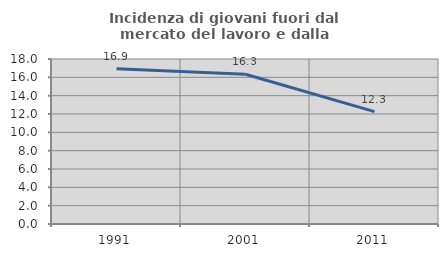
| Category | Incidenza di giovani fuori dal mercato del lavoro e dalla formazione  |
|---|---|
| 1991.0 | 16.949 |
| 2001.0 | 16.342 |
| 2011.0 | 12.264 |